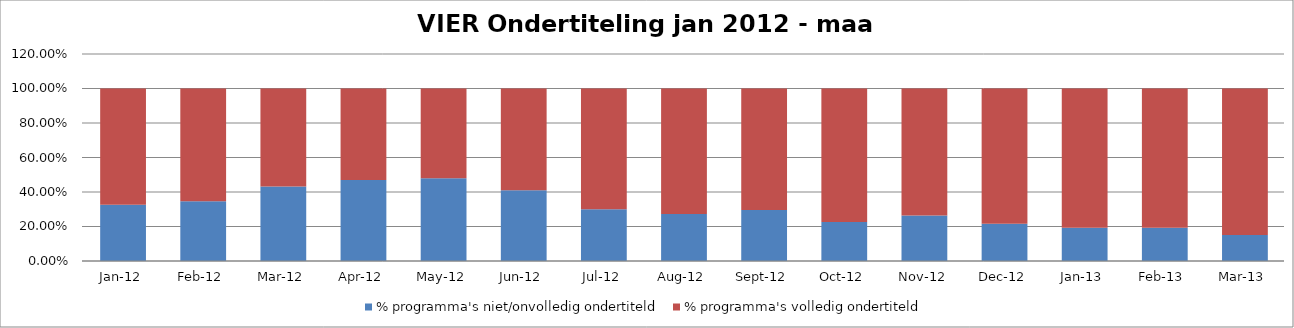
| Category | % programma's niet/onvolledig ondertiteld | % programma's volledig ondertiteld |
|---|---|---|
| 2012-01-01 | 0.326 | 0.674 |
| 2012-02-01 | 0.347 | 0.653 |
| 2012-03-01 | 0.432 | 0.568 |
| 2012-04-01 | 0.47 | 0.53 |
| 2012-05-01 | 0.48 | 0.52 |
| 2012-06-01 | 0.41 | 0.59 |
| 2012-07-01 | 0.301 | 0.699 |
| 2012-08-01 | 0.272 | 0.728 |
| 2012-09-01 | 0.296 | 0.704 |
| 2012-10-01 | 0.226 | 0.774 |
| 2012-11-01 | 0.264 | 0.736 |
| 2012-12-01 | 0.216 | 0.784 |
| 2013-01-01 | 0.192 | 0.808 |
| 2013-02-01 | 0.193 | 0.807 |
| 2013-03-01 | 0.151 | 0.849 |